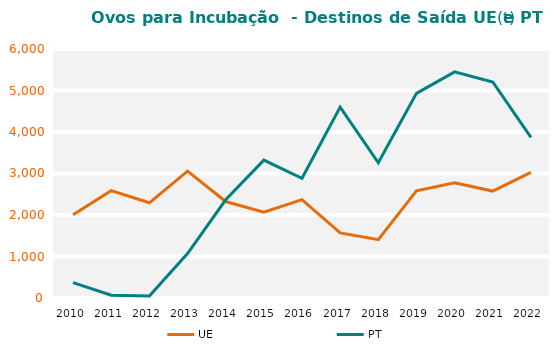
| Category | UE | PT |
|---|---|---|
| 2010.0 | 2007.808 | 371.831 |
| 2011.0 | 2585.776 | 67.966 |
| 2012.0 | 2294.029 | 50.768 |
| 2013.0 | 3057.357 | 1070.997 |
| 2014.0 | 2324.273 | 2367.109 |
| 2015.0 | 2070.559 | 3321.768 |
| 2016.0 | 2371.169 | 2885.959 |
| 2017.0 | 1568.831 | 4600.966 |
| 2018.0 | 1405.312 | 3258.794 |
| 2019.0 | 2581.085 | 4930.684 |
| 2020.0 | 2776.868 | 5449.788 |
| 2021.0 | 2576.38 | 5204.271 |
| 2022.0 | 3026.415 | 3870.789 |